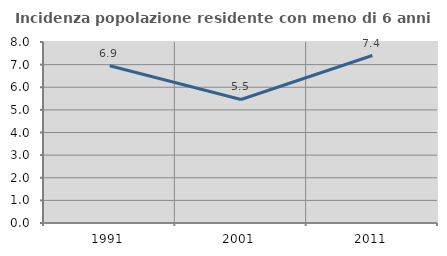
| Category | Incidenza popolazione residente con meno di 6 anni |
|---|---|
| 1991.0 | 6.948 |
| 2001.0 | 5.46 |
| 2011.0 | 7.402 |